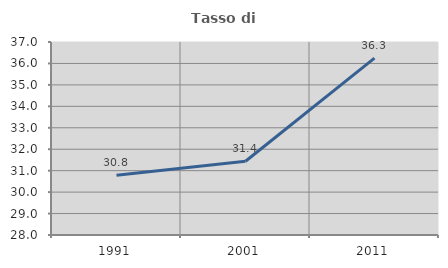
| Category | Tasso di occupazione   |
|---|---|
| 1991.0 | 30.781 |
| 2001.0 | 31.438 |
| 2011.0 | 36.25 |